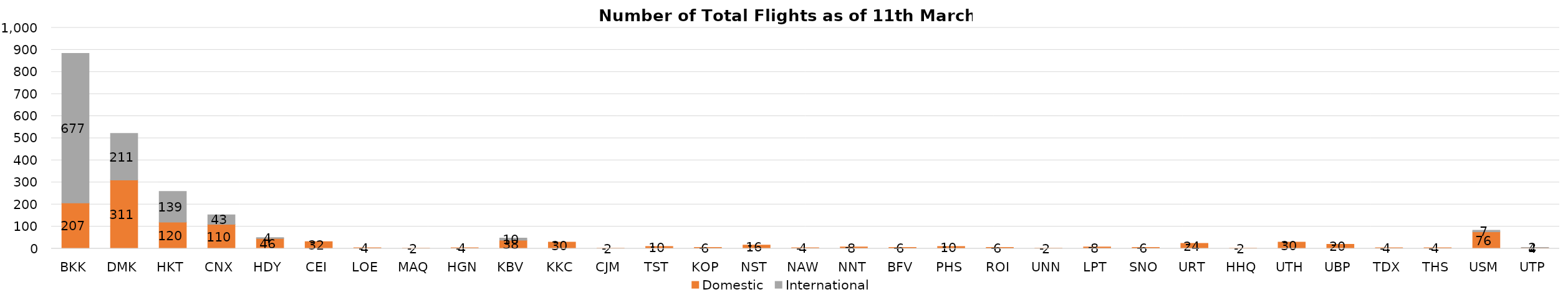
| Category | Domestic | International |
|---|---|---|
| BKK | 207 | 677 |
| DMK | 311 | 211 |
| HKT | 120 | 139 |
| CNX | 110 | 43 |
| HDY | 46 | 4 |
| CEI | 32 | 0 |
| LOE | 4 | 0 |
| MAQ | 2 | 0 |
| HGN | 4 | 0 |
| KBV | 38 | 10 |
| KKC | 30 | 0 |
| CJM | 2 | 0 |
| TST | 10 | 0 |
| KOP | 6 | 0 |
| NST | 16 | 0 |
| NAW | 4 | 0 |
| NNT | 8 | 0 |
| BFV | 6 | 0 |
| PHS | 10 | 0 |
| ROI | 6 | 0 |
| UNN | 2 | 0 |
| LPT | 8 | 0 |
| SNO | 6 | 0 |
| URT | 24 | 0 |
| HHQ | 2 | 0 |
| UTH | 30 | 0 |
| UBP | 20 | 0 |
| TDX | 4 | 0 |
| THS | 4 | 0 |
| USM | 76 | 7 |
| UTP | 4 | 2 |